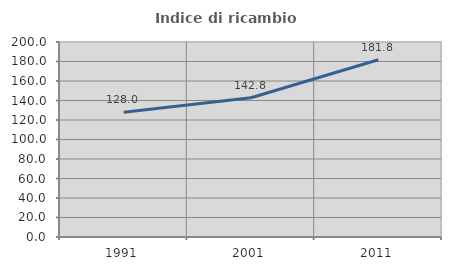
| Category | Indice di ricambio occupazionale  |
|---|---|
| 1991.0 | 127.984 |
| 2001.0 | 142.769 |
| 2011.0 | 181.77 |